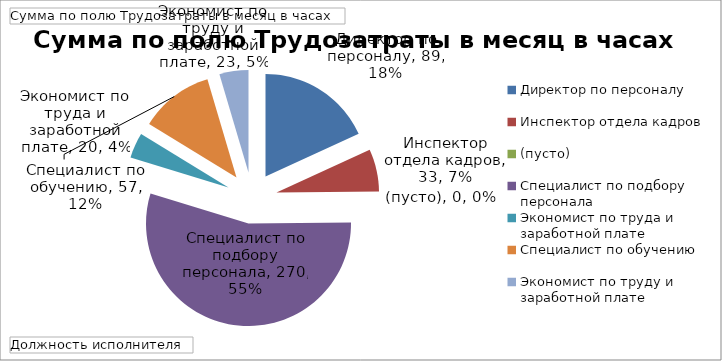
| Category | Итог |
|---|---|
| Директор по персоналу | 89.208 |
| Инспектор отдела кадров | 32.867 |
| (пусто) | 0 |
| Специалист по подбору персонала | 269.667 |
| Экономист по труда и заработной плате | 19.708 |
| Специалист по обучению | 57.333 |
| Экономист по труду и заработной плате | 22.5 |